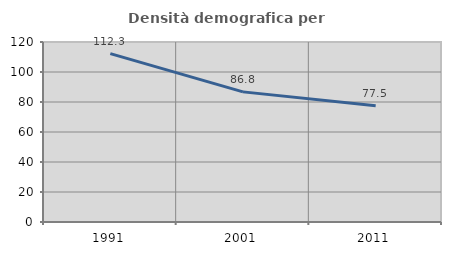
| Category | Densità demografica |
|---|---|
| 1991.0 | 112.286 |
| 2001.0 | 86.754 |
| 2011.0 | 77.491 |